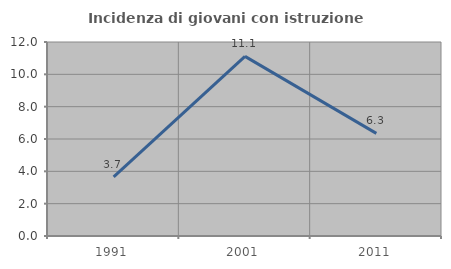
| Category | Incidenza di giovani con istruzione universitaria |
|---|---|
| 1991.0 | 3.659 |
| 2001.0 | 11.111 |
| 2011.0 | 6.349 |